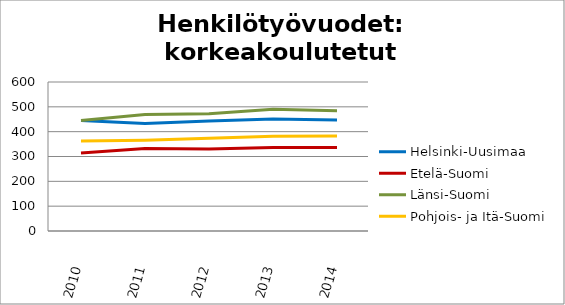
| Category | Helsinki-Uusimaa | Etelä-Suomi | Länsi-Suomi | Pohjois- ja Itä-Suomi |
|---|---|---|---|---|
| 2010.0 | 444.76 | 313.89 | 444.7 | 362.38 |
| 2011.0 | 433.31 | 332.61 | 469.55 | 365.87 |
| 2012.0 | 442.64 | 330.06 | 472.57 | 373.75 |
| 2013.0 | 450.82 | 336.49 | 490.19 | 381.43 |
| 2014.0 | 447.2 | 336.53 | 484.07 | 382.35 |